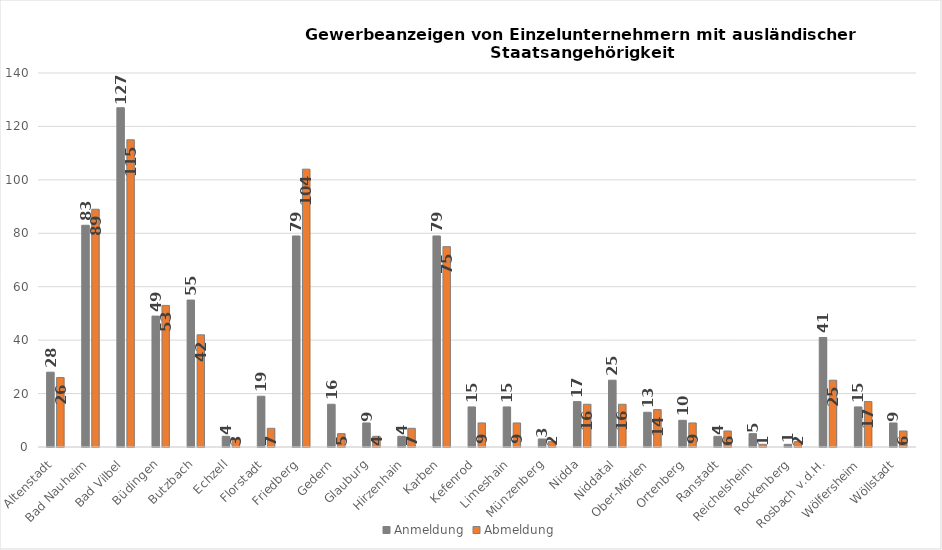
| Category | Anmeldung | Abmeldung |
|---|---|---|
| Altenstadt | 28 | 26 |
| Bad Nauheim | 83 | 89 |
| Bad Vilbel | 127 | 115 |
| Büdingen | 49 | 53 |
| Butzbach | 55 | 42 |
| Echzell | 4 | 3 |
| Florstadt | 19 | 7 |
| Friedberg | 79 | 104 |
| Gedern | 16 | 5 |
| Glauburg | 9 | 4 |
| Hirzenhain | 4 | 7 |
| Karben | 79 | 75 |
| Kefenrod | 15 | 9 |
| Limeshain | 15 | 9 |
| Münzenberg | 3 | 2 |
| Nidda | 17 | 16 |
| Niddatal | 25 | 16 |
| Ober-Mörlen | 13 | 14 |
| Ortenberg | 10 | 9 |
| Ranstadt | 4 | 6 |
| Reichelsheim | 5 | 1 |
| Rockenberg | 1 | 2 |
| Rosbach v.d.H. | 41 | 25 |
| Wölfersheim | 15 | 17 |
| Wöllstadt | 9 | 6 |